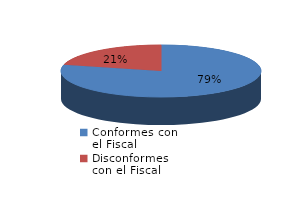
| Category | Series 0 |
|---|---|
| 0 | 2109 |
| 1 | 563 |